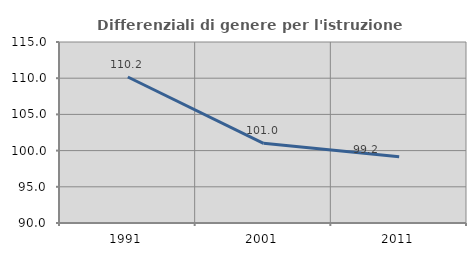
| Category | Differenziali di genere per l'istruzione superiore |
|---|---|
| 1991.0 | 110.166 |
| 2001.0 | 101.006 |
| 2011.0 | 99.15 |